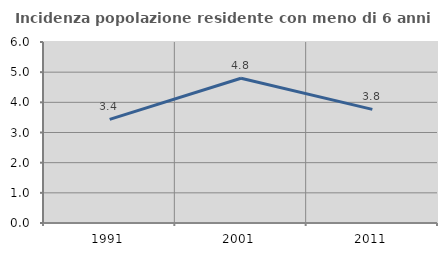
| Category | Incidenza popolazione residente con meno di 6 anni |
|---|---|
| 1991.0 | 3.435 |
| 2001.0 | 4.8 |
| 2011.0 | 3.766 |